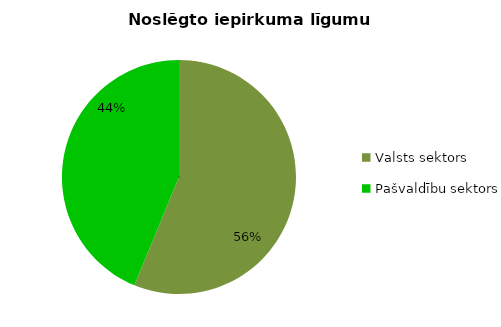
| Category | Noslēgto iepirkuma līgumu skaits |
|---|---|
| Valsts sektors | 9023 |
| Pašvaldību sektors | 7023 |